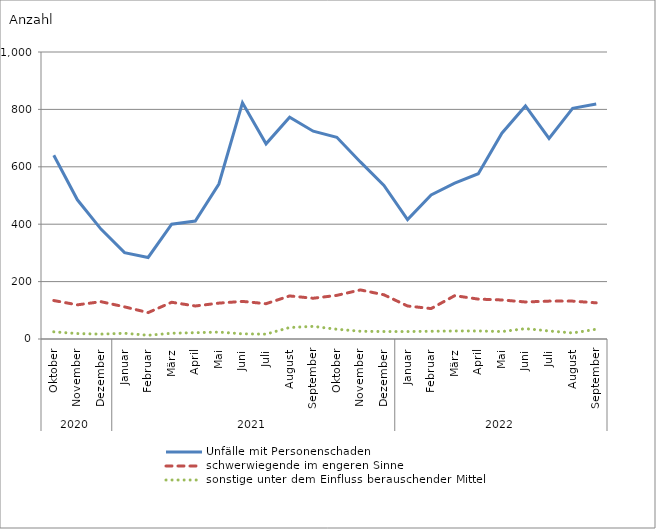
| Category | Unfälle mit Personenschaden | schwerwiegende im engeren Sinne | sonstige unter dem Einfluss berauschender Mittel |
|---|---|---|---|
| 0 | 640 | 134 | 25 |
| 1 | 485 | 119 | 19 |
| 2 | 383 | 130 | 17 |
| 3 | 301 | 112 | 20 |
| 4 | 284 | 92 | 13 |
| 5 | 400 | 128 | 20 |
| 6 | 411 | 115 | 22 |
| 7 | 540 | 125 | 24 |
| 8 | 823 | 131 | 18 |
| 9 | 680 | 123 | 17 |
| 10 | 773 | 150 | 40 |
| 11 | 724 | 142 | 44 |
| 12 | 703 | 152 | 34 |
| 13 | 617 | 171 | 27 |
| 14 | 535 | 154 | 26 |
| 15 | 416 | 115 | 26 |
| 16 | 502 | 106 | 27 |
| 17 | 543 | 151 | 28 |
| 18 | 576 | 139 | 28 |
| 19 | 717 | 136 | 26 |
| 20 | 812 | 129 | 36 |
| 21 | 699 | 132 | 28 |
| 22 | 804 | 132 | 21 |
| 23 | 819 | 126 | 34 |